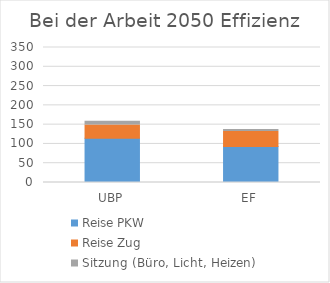
| Category | Reise PKW | Reise Zug | Sitzung (Büro, Licht, Heizen) |
|---|---|---|---|
| UBP | 114.557 | 34.555 | 9.374 |
| EF | 93.527 | 38.645 | 5.284 |